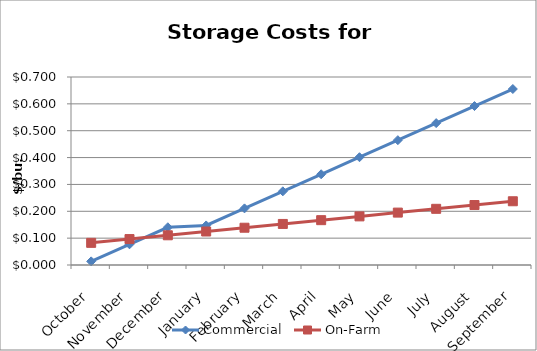
| Category | Commercial | On-Farm |
|---|---|---|
| October | 0.014 | 0.082 |
| November | 0.077 | 0.097 |
| December | 0.14 | 0.111 |
| January | 0.147 | 0.125 |
| February | 0.211 | 0.139 |
| March | 0.274 | 0.153 |
| April | 0.338 | 0.167 |
| May | 0.401 | 0.181 |
| June | 0.465 | 0.195 |
| July | 0.528 | 0.209 |
| August | 0.592 | 0.223 |
| September | 0.655 | 0.237 |